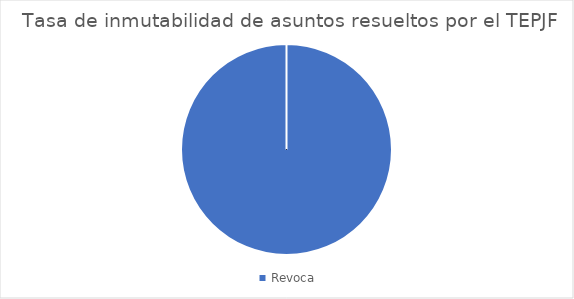
| Category | Tasa de inmutabilidad de asuntos resueltos por el TEPJF |
|---|---|
| Revoca | 1 |